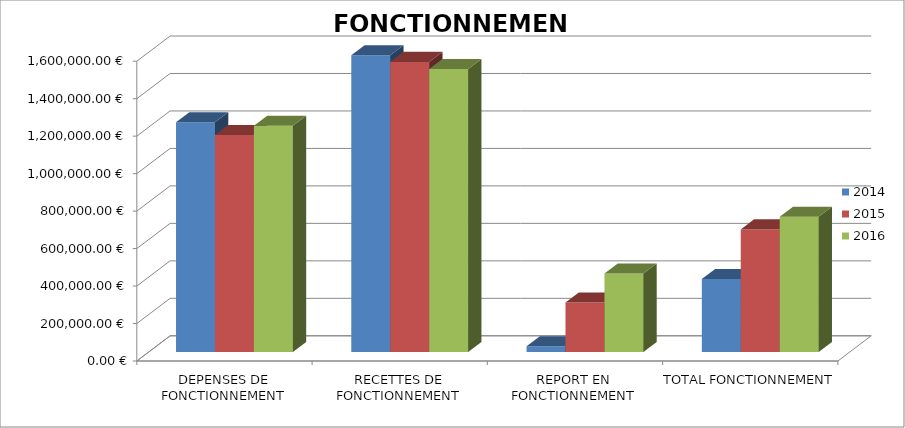
| Category | 2014 | 2015 | 2016 |
|---|---|---|---|
| DEPENSES DE FONCTIONNEMENT | 1225881 | 1157971 | 1207319 |
| RECETTES DE FONCTIONNEMENT | 1584057 | 1548528 | 1509981 |
| REPORT EN FONCTIONNEMENT | 30996 | 263740 | 418905 |
| TOTAL FONCTIONNEMENT | 389172 | 654297 | 721567 |